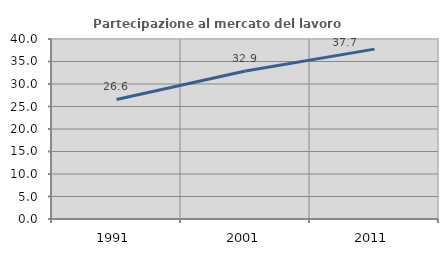
| Category | Partecipazione al mercato del lavoro  femminile |
|---|---|
| 1991.0 | 26.571 |
| 2001.0 | 32.882 |
| 2011.0 | 37.749 |